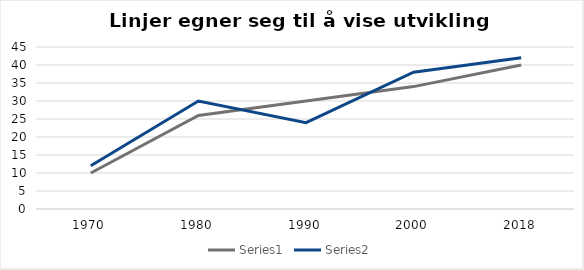
| Category | Series 0 | Series 1 |
|---|---|---|
| 1970 | 10 | 12 |
| 1980 | 26 | 30 |
| 1990 | 30 | 24 |
| 2000 | 34 | 38 |
| 2018 | 40 | 42 |